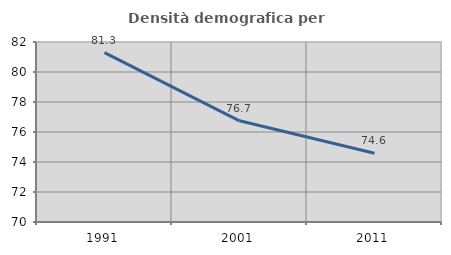
| Category | Densità demografica |
|---|---|
| 1991.0 | 81.291 |
| 2001.0 | 76.748 |
| 2011.0 | 74.584 |